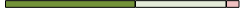
| Category | Series 0 | Series 1 | Series 2 | Series 3 |
|---|---|---|---|---|
| 0 | 10 | 7 | 1 | 0 |